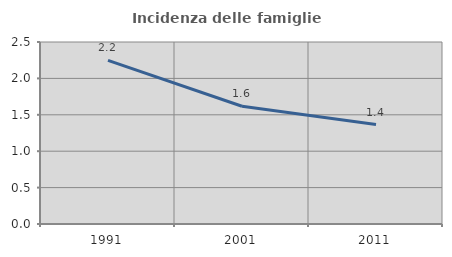
| Category | Incidenza delle famiglie numerose |
|---|---|
| 1991.0 | 2.247 |
| 2001.0 | 1.617 |
| 2011.0 | 1.366 |